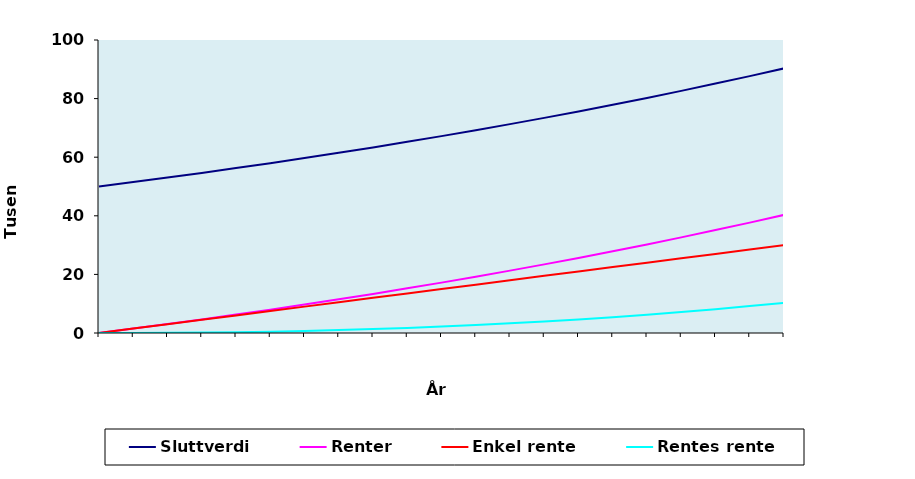
| Category | Sluttverdi | Renter | Enkel rente | Rentes rente |
|---|---|---|---|---|
| nan | 50000 | 0 | 0 | 0 |
| 1.0 | 51500 | 1500 | 1500 | 0 |
| 2.0 | 53045 | 3045 | 3000 | 45 |
| 3.0 | 54636.35 | 4636.35 | 4500 | 136.35 |
| 4.0 | 56275.44 | 6275.44 | 6000 | 275.44 |
| 5.0 | 57963.704 | 7963.704 | 7500 | 463.704 |
| 6.0 | 59702.615 | 9702.615 | 9000 | 702.615 |
| 7.0 | 61493.693 | 11493.693 | 10500 | 993.693 |
| 8.0 | 63338.504 | 13338.504 | 12000 | 1338.504 |
| 9.0 | 65238.659 | 15238.659 | 13500 | 1738.659 |
| 10.0 | 67195.819 | 17195.819 | 15000 | 2195.819 |
| 11.0 | 69211.694 | 19211.694 | 16500 | 2711.694 |
| 12.0 | 71288.044 | 21288.044 | 18000 | 3288.044 |
| 13.0 | 73426.686 | 23426.686 | 19500 | 3926.686 |
| 14.0 | 75629.486 | 25629.486 | 21000 | 4629.486 |
| 15.0 | 77898.371 | 27898.371 | 22500 | 5398.371 |
| 16.0 | 80235.322 | 30235.322 | 24000 | 6235.322 |
| 17.0 | 82642.382 | 32642.382 | 25500 | 7142.382 |
| 18.0 | 85121.653 | 35121.653 | 27000 | 8121.653 |
| 19.0 | 87675.303 | 37675.303 | 28500 | 9175.303 |
| 20.0 | 90305.562 | 40305.562 | 30000 | 10305.562 |